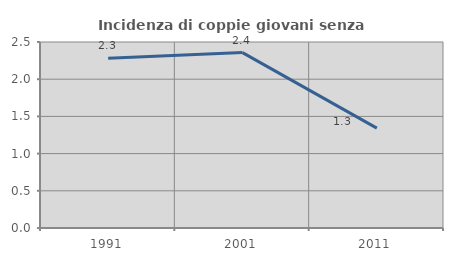
| Category | Incidenza di coppie giovani senza figli |
|---|---|
| 1991.0 | 2.28 |
| 2001.0 | 2.358 |
| 2011.0 | 1.342 |